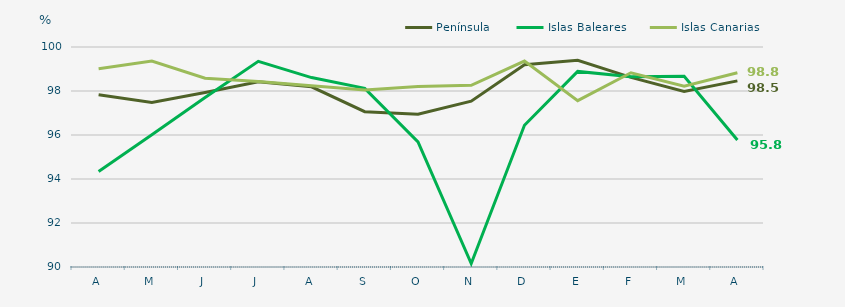
| Category | Península | Islas Baleares | Islas Canarias |
|---|---|---|---|
| A | 97.83 | 94.34 | 99.01 |
| M | 97.48 | 96.01 | 99.36 |
| J | 97.93 | 97.7 | 98.58 |
| J | 98.42 | 99.35 | 98.43 |
| A | 98.19 | 98.61 | 98.24 |
| S | 97.06 | 98.12 | 98.05 |
| O | 96.94 | 95.69 | 98.21 |
| N | 97.54 | 90.16 | 98.26 |
| D | 99.19 | 96.44 | 99.36 |
| E | 99.4 | 98.89 | 97.56 |
| F | 98.62 | 98.65 | 98.83 |
| M | 97.98 | 98.67 | 98.22 |
| A | 98.46 | 95.77 | 98.83 |